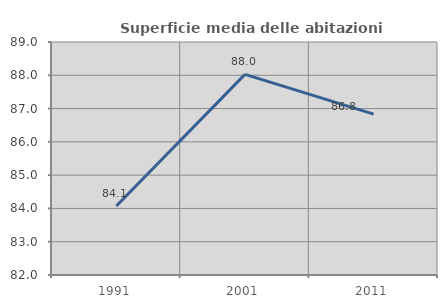
| Category | Superficie media delle abitazioni occupate |
|---|---|
| 1991.0 | 84.074 |
| 2001.0 | 88.028 |
| 2011.0 | 86.832 |